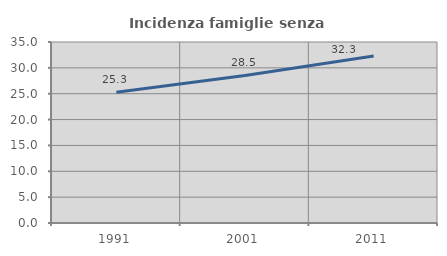
| Category | Incidenza famiglie senza nuclei |
|---|---|
| 1991.0 | 25.293 |
| 2001.0 | 28.525 |
| 2011.0 | 32.283 |